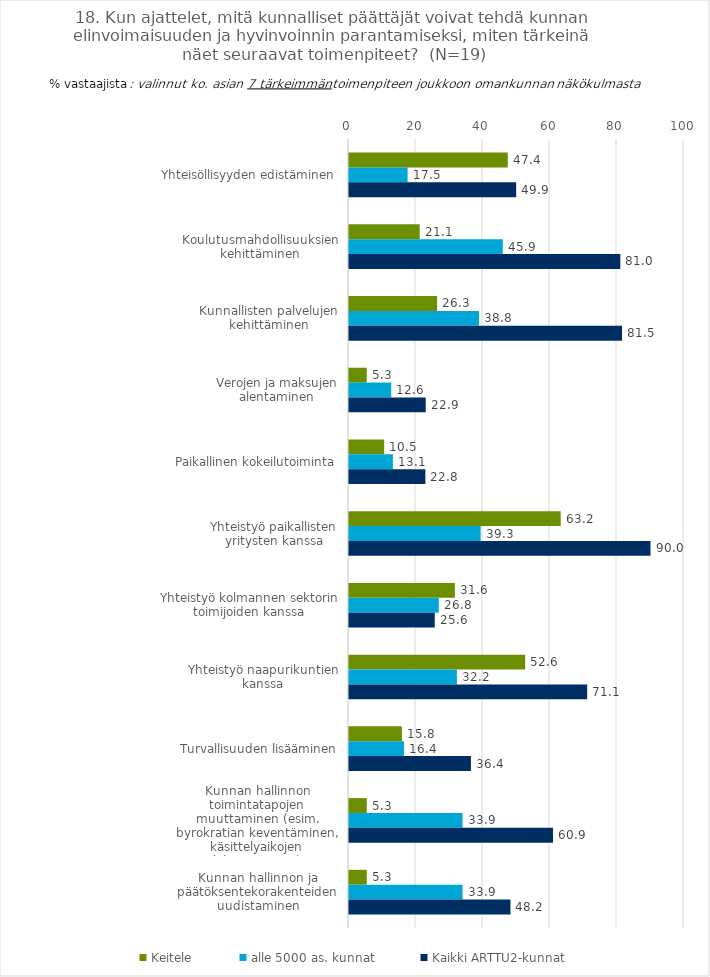
| Category | Keitele | alle 5000 as. kunnat | Kaikki ARTTU2-kunnat |
|---|---|---|---|
| Yhteisöllisyyden edistäminen | 47.4 | 17.5 | 49.9 |
| Koulutusmahdollisuuksien kehittäminen | 21.1 | 45.9 | 81 |
| Kunnallisten palvelujen kehittäminen | 26.3 | 38.8 | 81.5 |
| Verojen ja maksujen alentaminen | 5.3 | 12.6 | 22.9 |
| Paikallinen kokeilutoiminta | 10.5 | 13.1 | 22.8 |
| Yhteistyö paikallisten yritysten kanssa | 63.2 | 39.3 | 90 |
| Yhteistyö kolmannen sektorin toimijoiden kanssa | 31.6 | 26.8 | 25.6 |
| Yhteistyö naapurikuntien kanssa | 52.6 | 32.2 | 71.1 |
| Turvallisuuden lisääminen | 15.8 | 16.4 | 36.4 |
| Kunnan hallinnon toimintatapojen muuttaminen (esim. byrokratian keventäminen, käsittelyaikojen lyhentäminen) | 5.3 | 33.9 | 60.9 |
| Kunnan hallinnon ja päätöksentekorakenteiden uudistaminen | 5.3 | 33.9 | 48.2 |